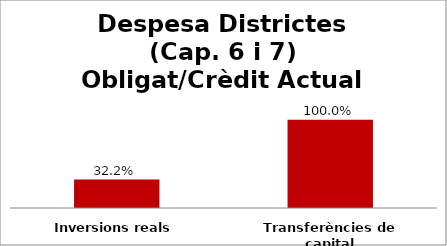
| Category | Series 0 |
|---|---|
| Inversions reals | 0.322 |
| Transferències de capital | 1 |